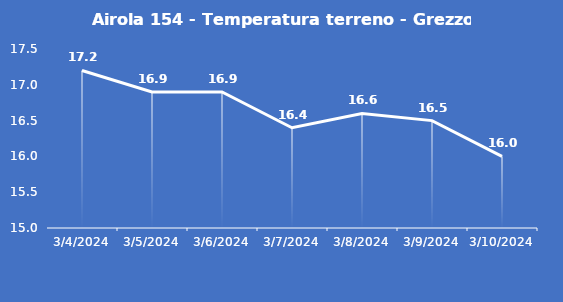
| Category | Airola 154 - Temperatura terreno - Grezzo (°C) |
|---|---|
| 3/4/24 | 17.2 |
| 3/5/24 | 16.9 |
| 3/6/24 | 16.9 |
| 3/7/24 | 16.4 |
| 3/8/24 | 16.6 |
| 3/9/24 | 16.5 |
| 3/10/24 | 16 |